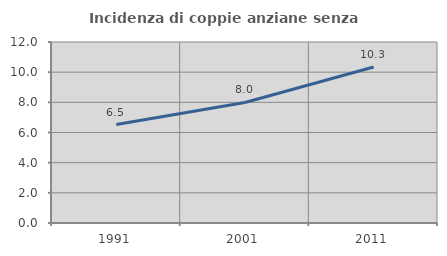
| Category | Incidenza di coppie anziane senza figli  |
|---|---|
| 1991.0 | 6.525 |
| 2001.0 | 7.991 |
| 2011.0 | 10.345 |